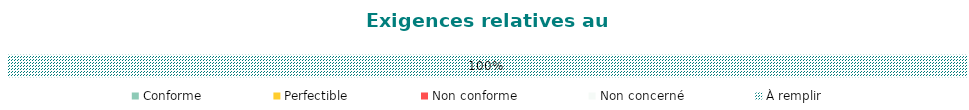
| Category | Conforme | Perfectible | Non conforme | Non concerné | À remplir |
|---|---|---|---|---|---|
| Processus | 0 | 0 | 0 | 0 | 1 |